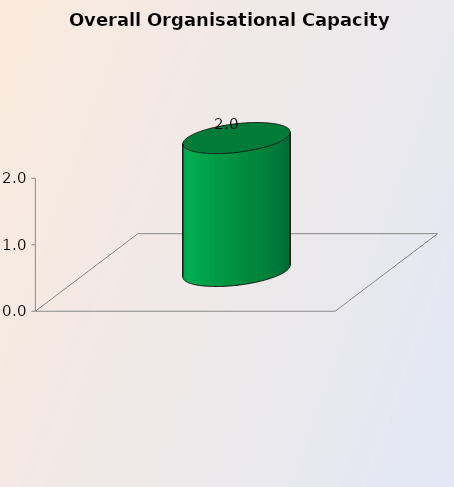
| Category | Overall Organisational Capacity Score |
|---|---|
| Overall Category Score | 2 |